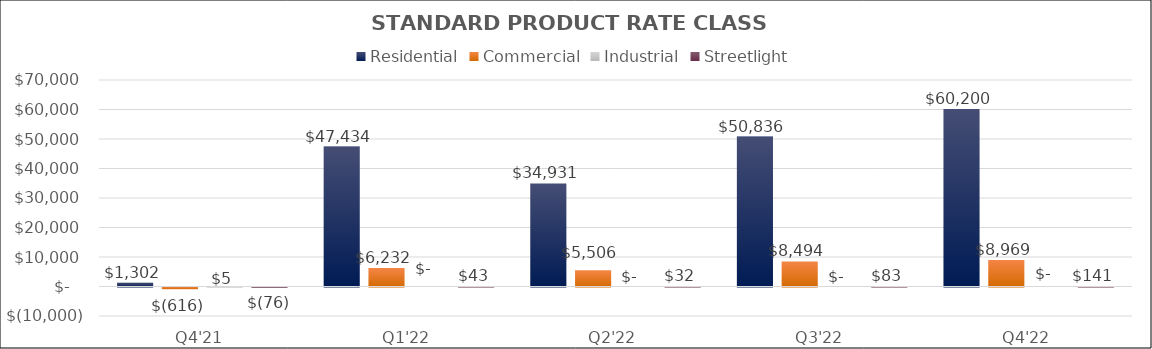
| Category | Residential | Commercial | Industrial | Streetlight |
|---|---|---|---|---|
| Q4'21 | 1302.024 | -615.876 | 5.28 | -76.121 |
| Q1'22 | 47433.831 | 6232.078 | 0 | 43.006 |
| Q2'22 | 34930.937 | 5506.476 | 0 | 31.67 |
| Q3'22 | 50835.505 | 8494.17 | 0 | 83.495 |
| Q4'22 | 60199.765 | 8969.257 | 0 | 141.445 |